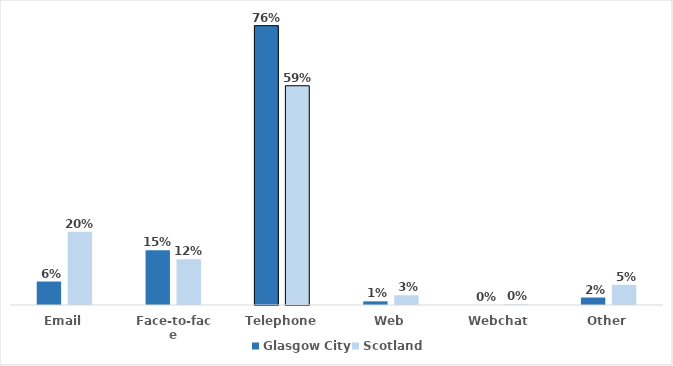
| Category | Glasgow City | Scotland |
|---|---|---|
| Email | 0.064 | 0.199 |
| Face-to-face | 0.149 | 0.124 |
| Telephone | 0.758 | 0.595 |
| Web | 0.01 | 0.026 |
| Webchat | 0 | 0.002 |
| Other | 0.02 | 0.055 |